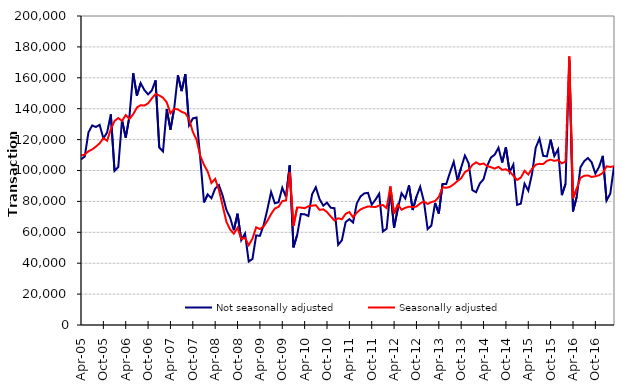
| Category | Not seasonally adjusted | Seasonally adjusted |
|---|---|---|
| 2005-04-01 | 107190 | 109680 |
| 2005-05-01 | 109010 | 110270 |
| 2005-06-01 | 124660 | 112460 |
| 2005-07-01 | 129170 | 113610 |
| 2005-08-01 | 128150 | 115470 |
| 2005-09-01 | 129560 | 117590 |
| 2005-10-01 | 120860 | 120990 |
| 2005-11-01 | 124540 | 119270 |
| 2005-12-01 | 136300 | 126640 |
| 2006-01-01 | 99740 | 132100 |
| 2006-02-01 | 102230 | 133940 |
| 2006-03-01 | 132710 | 132080 |
| 2006-04-01 | 121270 | 135880 |
| 2006-05-01 | 135030 | 133370 |
| 2006-06-01 | 162970 | 136400 |
| 2006-07-01 | 148490 | 140770 |
| 2006-08-01 | 156560 | 142280 |
| 2006-09-01 | 152100 | 142030 |
| 2006-10-01 | 149270 | 143440 |
| 2006-11-01 | 151770 | 146670 |
| 2006-12-01 | 158310 | 149510 |
| 2007-01-01 | 114880 | 148580 |
| 2007-02-01 | 112280 | 147120 |
| 2007-03-01 | 139780 | 144110 |
| 2007-04-01 | 126450 | 136980 |
| 2007-05-01 | 140110 | 139920 |
| 2007-06-01 | 161680 | 139530 |
| 2007-07-01 | 151390 | 137980 |
| 2007-08-01 | 162330 | 137040 |
| 2007-09-01 | 129210 | 133260 |
| 2007-10-01 | 133700 | 124980 |
| 2007-11-01 | 134320 | 119940 |
| 2007-12-01 | 107680 | 109440 |
| 2008-01-01 | 79350 | 103660 |
| 2008-02-01 | 84540 | 99300 |
| 2008-03-01 | 82050 | 91920 |
| 2008-04-01 | 88350 | 94610 |
| 2008-05-01 | 90570 | 87440 |
| 2008-06-01 | 83780 | 77280 |
| 2008-07-01 | 74560 | 66860 |
| 2008-08-01 | 69560 | 61820 |
| 2008-09-01 | 61330 | 59130 |
| 2008-10-01 | 72020 | 62890 |
| 2008-11-01 | 54910 | 55610 |
| 2008-12-01 | 59180 | 56400 |
| 2009-01-01 | 41060 | 51660 |
| 2009-02-01 | 42750 | 55930 |
| 2009-03-01 | 57990 | 63250 |
| 2009-04-01 | 57690 | 62120 |
| 2009-05-01 | 64640 | 63760 |
| 2009-06-01 | 74760 | 67390 |
| 2009-07-01 | 86090 | 71810 |
| 2009-08-01 | 78820 | 75400 |
| 2009-09-01 | 79480 | 76470 |
| 2009-10-01 | 88840 | 80170 |
| 2009-11-01 | 82910 | 80640 |
| 2009-12-01 | 103320 | 98940 |
| 2010-01-01 | 50230 | 64150 |
| 2010-02-01 | 58370 | 76080 |
| 2010-03-01 | 71830 | 76000 |
| 2010-04-01 | 71660 | 75600 |
| 2010-05-01 | 70560 | 76820 |
| 2010-06-01 | 84580 | 77240 |
| 2010-07-01 | 89190 | 77530 |
| 2010-08-01 | 81420 | 74550 |
| 2010-09-01 | 77250 | 74860 |
| 2010-10-01 | 79190 | 73120 |
| 2010-11-01 | 75890 | 70270 |
| 2010-12-01 | 75600 | 67630 |
| 2011-01-01 | 51900 | 69100 |
| 2011-02-01 | 54880 | 68440 |
| 2011-03-01 | 66600 | 71960 |
| 2011-04-01 | 68510 | 73130 |
| 2011-05-01 | 66340 | 69660 |
| 2011-06-01 | 78780 | 72760 |
| 2011-07-01 | 83180 | 74810 |
| 2011-08-01 | 85180 | 75910 |
| 2011-09-01 | 85530 | 76700 |
| 2011-10-01 | 77840 | 76540 |
| 2011-11-01 | 81110 | 76320 |
| 2011-12-01 | 84940 | 77310 |
| 2012-01-01 | 60530 | 77650 |
| 2012-02-01 | 62300 | 75570 |
| 2012-03-01 | 86720 | 89740 |
| 2012-04-01 | 63040 | 72050 |
| 2012-05-01 | 75350 | 77990 |
| 2012-06-01 | 85310 | 74610 |
| 2012-07-01 | 81880 | 75850 |
| 2012-08-01 | 90440 | 76580 |
| 2012-09-01 | 74390 | 76310 |
| 2012-10-01 | 83060 | 76690 |
| 2012-11-01 | 89450 | 78670 |
| 2012-12-01 | 80010 | 79910 |
| 2013-01-01 | 62060 | 78330 |
| 2013-02-01 | 64360 | 79530 |
| 2013-03-01 | 79000 | 80240 |
| 2013-04-01 | 72180 | 82840 |
| 2013-05-01 | 91270 | 89060 |
| 2013-06-01 | 91270 | 88840 |
| 2013-07-01 | 98710 | 89400 |
| 2013-08-01 | 105630 | 91110 |
| 2013-09-01 | 93680 | 93190 |
| 2013-10-01 | 101920 | 95020 |
| 2013-11-01 | 109670 | 98920 |
| 2013-12-01 | 104700 | 100410 |
| 2014-01-01 | 87280 | 103600 |
| 2014-02-01 | 85940 | 105310 |
| 2014-03-01 | 91570 | 103940 |
| 2014-04-01 | 94340 | 104550 |
| 2014-05-01 | 103110 | 102810 |
| 2014-06-01 | 108460 | 102140 |
| 2014-07-01 | 110280 | 101220 |
| 2014-08-01 | 114720 | 102360 |
| 2014-09-01 | 105170 | 100420 |
| 2014-10-01 | 114990 | 100800 |
| 2014-11-01 | 99010 | 99360 |
| 2014-12-01 | 103880 | 96610 |
| 2015-01-01 | 77750 | 93890 |
| 2015-02-01 | 78540 | 95420 |
| 2015-03-01 | 91490 | 99800 |
| 2015-04-01 | 86970 | 97370 |
| 2015-05-01 | 97800 | 101060 |
| 2015-06-01 | 114770 | 103750 |
| 2015-07-01 | 120610 | 104300 |
| 2015-08-01 | 109480 | 104180 |
| 2015-09-01 | 109160 | 106230 |
| 2015-10-01 | 119950 | 107040 |
| 2015-11-01 | 109370 | 106240 |
| 2015-12-01 | 113690 | 106780 |
| 2016-01-01 | 84030 | 104610 |
| 2016-02-01 | 91310 | 105740 |
| 2016-03-01 | 171370 | 173860 |
| 2016-04-01 | 73550 | 82060 |
| 2016-05-01 | 82980 | 88280 |
| 2016-06-01 | 102070 | 95220 |
| 2016-07-01 | 106020 | 96560 |
| 2016-08-01 | 108070 | 96800 |
| 2016-09-01 | 105350 | 95810 |
| 2016-10-01 | 98030 | 96260 |
| 2016-11-01 | 102360 | 96930 |
| 2016-12-01 | 109490 | 98420 |
| 2017-01-01 | 80580 | 102740 |
| 2017-02-01 | 84990 | 102290 |
| 2017-03-01 | 102740 | 102810 |